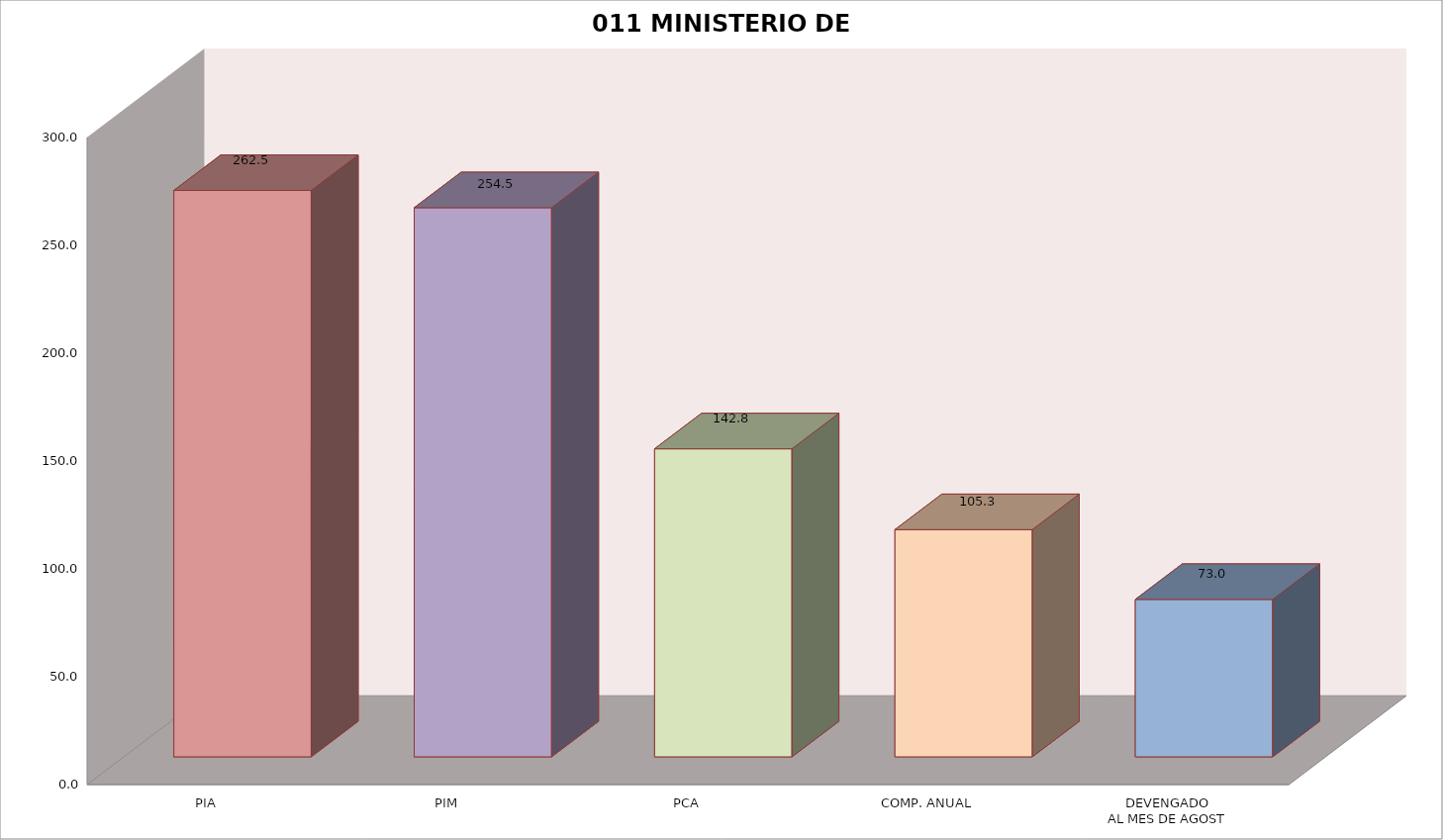
| Category | 011 MINISTERIO DE SALUD |
|---|---|
| PIA | 262.508 |
| PIM | 254.515 |
| PCA | 142.76 |
| COMP. ANUAL | 105.311 |
| DEVENGADO
AL MES DE AGOST | 72.958 |